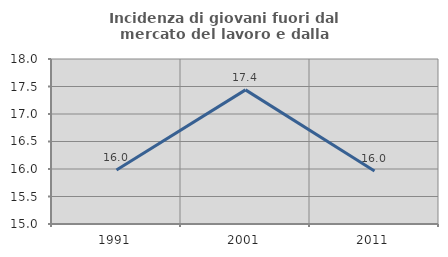
| Category | Incidenza di giovani fuori dal mercato del lavoro e dalla formazione  |
|---|---|
| 1991.0 | 15.982 |
| 2001.0 | 17.438 |
| 2011.0 | 15.963 |